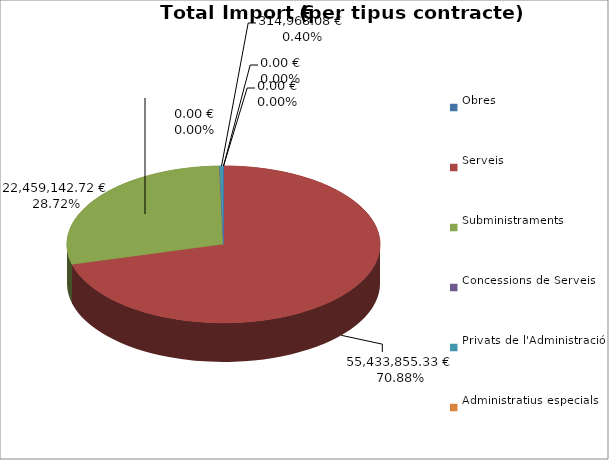
| Category | Total preu
(amb IVA) |
|---|---|
| Obres | 0 |
| Serveis | 55433855.33 |
| Subministraments | 22459142.72 |
| Concessions de Serveis | 0 |
| Privats de l'Administració | 314968.08 |
| Administratius especials | 0 |